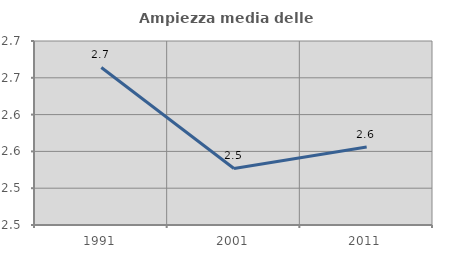
| Category | Ampiezza media delle famiglie |
|---|---|
| 1991.0 | 2.664 |
| 2001.0 | 2.527 |
| 2011.0 | 2.556 |